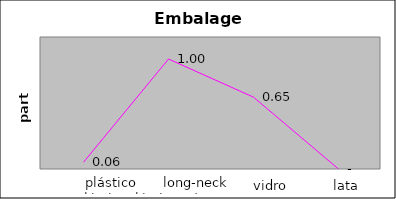
| Category | Series 1 |
|---|---|
| 0 | 0.061 |
| 1 | 1 |
| 2 | 0.653 |
| 3 | 0 |